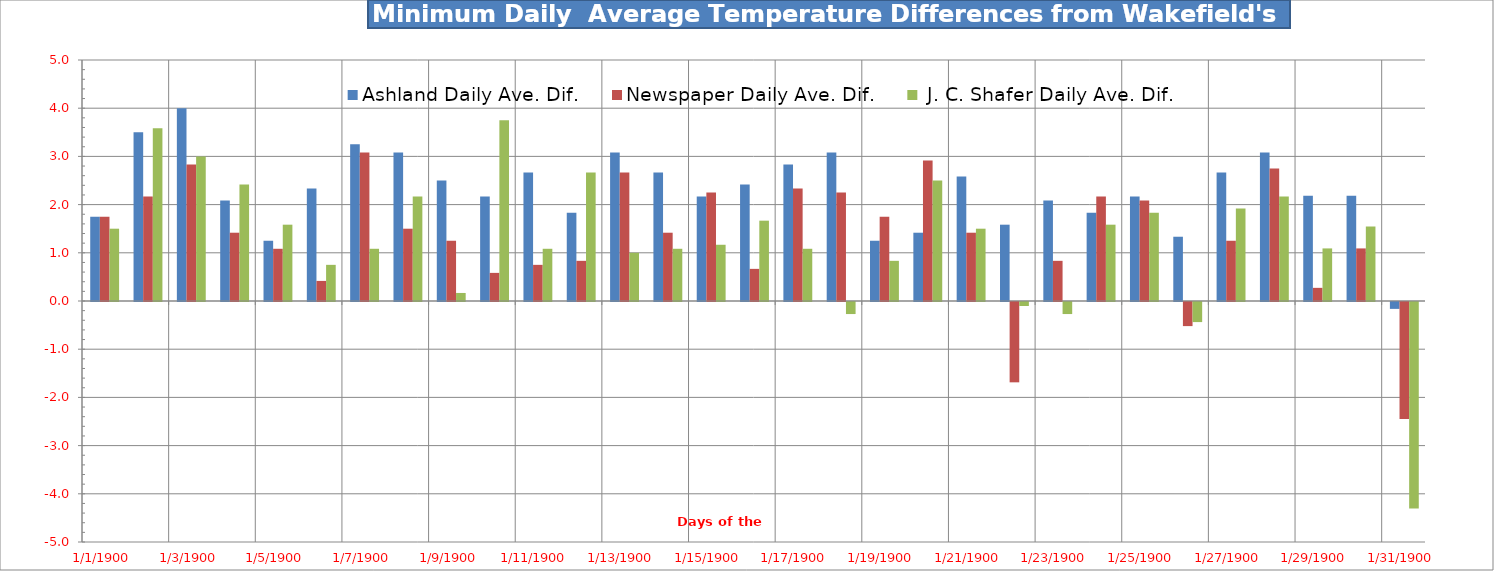
| Category | Ashland Daily Ave. Dif. | Newspaper Daily Ave. Dif. |  J. C. Shafer Daily Ave. Dif. |
|---|---|---|---|
| 0 | 1.75 | 1.75 | 1.5 |
| 1 | 3.5 | 2.167 | 3.583 |
| 2 | 4 | 2.833 | 3 |
| 3 | 2.083 | 1.417 | 2.417 |
| 4 | 1.25 | 1.083 | 1.583 |
| 5 | 2.333 | 0.417 | 0.75 |
| 6 | 3.25 | 3.083 | 1.083 |
| 7 | 3.083 | 1.5 | 2.167 |
| 8 | 2.5 | 1.25 | 0.167 |
| 9 | 2.167 | 0.583 | 3.75 |
| 10 | 2.667 | 0.75 | 1.083 |
| 11 | 1.833 | 0.833 | 2.667 |
| 12 | 3.083 | 2.667 | 1 |
| 13 | 2.667 | 1.417 | 1.083 |
| 14 | 2.167 | 2.25 | 1.167 |
| 15 | 2.417 | 0.667 | 1.667 |
| 16 | 2.833 | 2.333 | 1.083 |
| 17 | 3.083 | 2.25 | -0.25 |
| 18 | 1.25 | 1.75 | 0.833 |
| 19 | 1.417 | 2.917 | 2.5 |
| 20 | 2.583 | 1.417 | 1.5 |
| 21 | 1.583 | -1.667 | -0.083 |
| 22 | 2.083 | 0.833 | -0.25 |
| 23 | 1.833 | 2.167 | 1.583 |
| 24 | 2.167 | 2.083 | 1.833 |
| 25 | 1.333 | -0.5 | -0.417 |
| 26 | 2.667 | 1.25 | 1.917 |
| 27 | 3.083 | 2.75 | 2.167 |
| 28 | 2.182 | 0.273 | 1.091 |
| 29 | 2.182 | 1.091 | 1.545 |
| 30 | -0.143 | -2.429 | -4.286 |